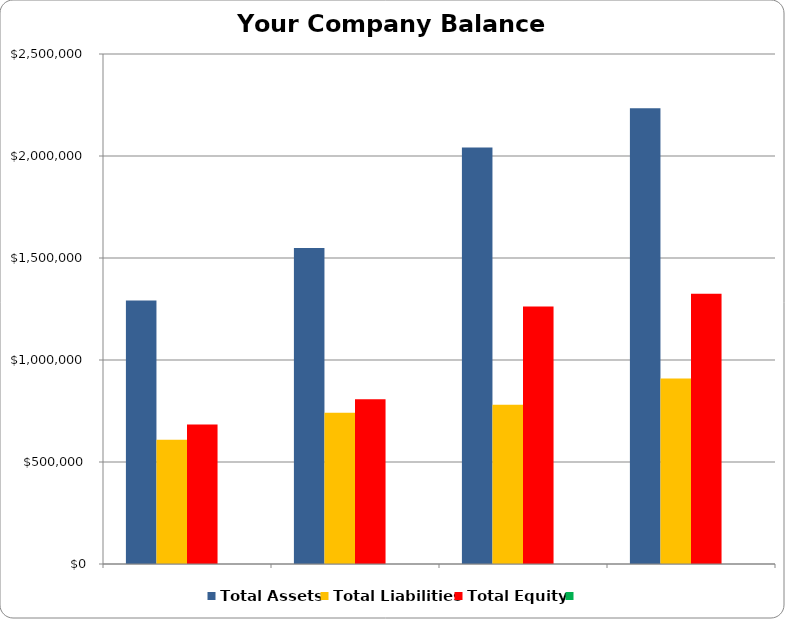
| Category | Total Assets | Total Liabilities | Total Equity | Series 3 |
|---|---|---|---|---|
|  | 1292258 | 608520 | 683738 |  |
|  | 1549096 | 741598 | 807498 |  |
|  | 2042035 | 780222 | 1261813 |  |
|  | 2233646 | 909032 | 1324614 |  |